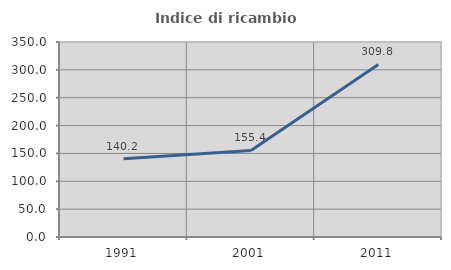
| Category | Indice di ricambio occupazionale  |
|---|---|
| 1991.0 | 140.244 |
| 2001.0 | 155.435 |
| 2011.0 | 309.778 |